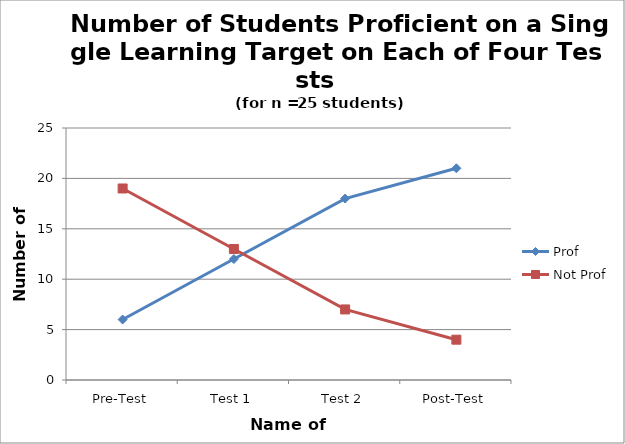
| Category | Prof | Not Prof |
|---|---|---|
| Pre-Test | 6 | 19 |
| Test 1 | 12 | 13 |
| Test 2 | 18 | 7 |
| Post-Test | 21 | 4 |